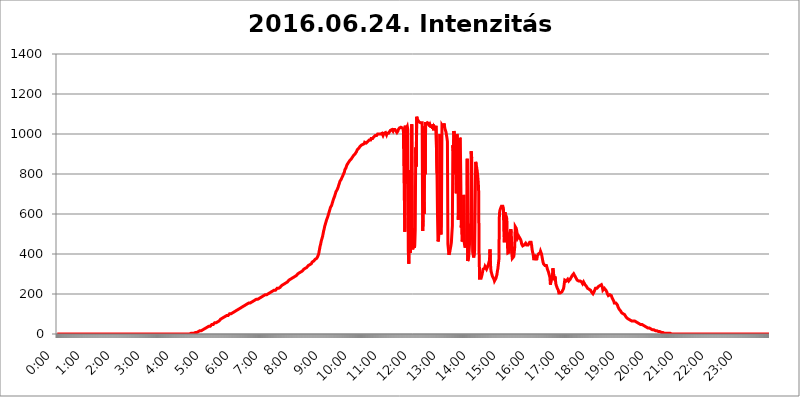
| Category | 2016.06.24. Intenzitás [W/m^2] |
|---|---|
| 0.0 | 0 |
| 0.0006944444444444445 | 0 |
| 0.001388888888888889 | 0 |
| 0.0020833333333333333 | 0 |
| 0.002777777777777778 | 0 |
| 0.003472222222222222 | 0 |
| 0.004166666666666667 | 0 |
| 0.004861111111111111 | 0 |
| 0.005555555555555556 | 0 |
| 0.0062499999999999995 | 0 |
| 0.006944444444444444 | 0 |
| 0.007638888888888889 | 0 |
| 0.008333333333333333 | 0 |
| 0.009027777777777779 | 0 |
| 0.009722222222222222 | 0 |
| 0.010416666666666666 | 0 |
| 0.011111111111111112 | 0 |
| 0.011805555555555555 | 0 |
| 0.012499999999999999 | 0 |
| 0.013194444444444444 | 0 |
| 0.013888888888888888 | 0 |
| 0.014583333333333332 | 0 |
| 0.015277777777777777 | 0 |
| 0.015972222222222224 | 0 |
| 0.016666666666666666 | 0 |
| 0.017361111111111112 | 0 |
| 0.018055555555555557 | 0 |
| 0.01875 | 0 |
| 0.019444444444444445 | 0 |
| 0.02013888888888889 | 0 |
| 0.020833333333333332 | 0 |
| 0.02152777777777778 | 0 |
| 0.022222222222222223 | 0 |
| 0.02291666666666667 | 0 |
| 0.02361111111111111 | 0 |
| 0.024305555555555556 | 0 |
| 0.024999999999999998 | 0 |
| 0.025694444444444447 | 0 |
| 0.02638888888888889 | 0 |
| 0.027083333333333334 | 0 |
| 0.027777777777777776 | 0 |
| 0.02847222222222222 | 0 |
| 0.029166666666666664 | 0 |
| 0.029861111111111113 | 0 |
| 0.030555555555555555 | 0 |
| 0.03125 | 0 |
| 0.03194444444444445 | 0 |
| 0.03263888888888889 | 0 |
| 0.03333333333333333 | 0 |
| 0.034027777777777775 | 0 |
| 0.034722222222222224 | 0 |
| 0.035416666666666666 | 0 |
| 0.036111111111111115 | 0 |
| 0.03680555555555556 | 0 |
| 0.0375 | 0 |
| 0.03819444444444444 | 0 |
| 0.03888888888888889 | 0 |
| 0.03958333333333333 | 0 |
| 0.04027777777777778 | 0 |
| 0.04097222222222222 | 0 |
| 0.041666666666666664 | 0 |
| 0.042361111111111106 | 0 |
| 0.04305555555555556 | 0 |
| 0.043750000000000004 | 0 |
| 0.044444444444444446 | 0 |
| 0.04513888888888889 | 0 |
| 0.04583333333333334 | 0 |
| 0.04652777777777778 | 0 |
| 0.04722222222222222 | 0 |
| 0.04791666666666666 | 0 |
| 0.04861111111111111 | 0 |
| 0.049305555555555554 | 0 |
| 0.049999999999999996 | 0 |
| 0.05069444444444445 | 0 |
| 0.051388888888888894 | 0 |
| 0.052083333333333336 | 0 |
| 0.05277777777777778 | 0 |
| 0.05347222222222222 | 0 |
| 0.05416666666666667 | 0 |
| 0.05486111111111111 | 0 |
| 0.05555555555555555 | 0 |
| 0.05625 | 0 |
| 0.05694444444444444 | 0 |
| 0.057638888888888885 | 0 |
| 0.05833333333333333 | 0 |
| 0.05902777777777778 | 0 |
| 0.059722222222222225 | 0 |
| 0.06041666666666667 | 0 |
| 0.061111111111111116 | 0 |
| 0.06180555555555556 | 0 |
| 0.0625 | 0 |
| 0.06319444444444444 | 0 |
| 0.06388888888888888 | 0 |
| 0.06458333333333334 | 0 |
| 0.06527777777777778 | 0 |
| 0.06597222222222222 | 0 |
| 0.06666666666666667 | 0 |
| 0.06736111111111111 | 0 |
| 0.06805555555555555 | 0 |
| 0.06874999999999999 | 0 |
| 0.06944444444444443 | 0 |
| 0.07013888888888889 | 0 |
| 0.07083333333333333 | 0 |
| 0.07152777777777779 | 0 |
| 0.07222222222222223 | 0 |
| 0.07291666666666667 | 0 |
| 0.07361111111111111 | 0 |
| 0.07430555555555556 | 0 |
| 0.075 | 0 |
| 0.07569444444444444 | 0 |
| 0.0763888888888889 | 0 |
| 0.07708333333333334 | 0 |
| 0.07777777777777778 | 0 |
| 0.07847222222222222 | 0 |
| 0.07916666666666666 | 0 |
| 0.0798611111111111 | 0 |
| 0.08055555555555556 | 0 |
| 0.08125 | 0 |
| 0.08194444444444444 | 0 |
| 0.08263888888888889 | 0 |
| 0.08333333333333333 | 0 |
| 0.08402777777777777 | 0 |
| 0.08472222222222221 | 0 |
| 0.08541666666666665 | 0 |
| 0.08611111111111112 | 0 |
| 0.08680555555555557 | 0 |
| 0.08750000000000001 | 0 |
| 0.08819444444444445 | 0 |
| 0.08888888888888889 | 0 |
| 0.08958333333333333 | 0 |
| 0.09027777777777778 | 0 |
| 0.09097222222222222 | 0 |
| 0.09166666666666667 | 0 |
| 0.09236111111111112 | 0 |
| 0.09305555555555556 | 0 |
| 0.09375 | 0 |
| 0.09444444444444444 | 0 |
| 0.09513888888888888 | 0 |
| 0.09583333333333333 | 0 |
| 0.09652777777777777 | 0 |
| 0.09722222222222222 | 0 |
| 0.09791666666666667 | 0 |
| 0.09861111111111111 | 0 |
| 0.09930555555555555 | 0 |
| 0.09999999999999999 | 0 |
| 0.10069444444444443 | 0 |
| 0.1013888888888889 | 0 |
| 0.10208333333333335 | 0 |
| 0.10277777777777779 | 0 |
| 0.10347222222222223 | 0 |
| 0.10416666666666667 | 0 |
| 0.10486111111111111 | 0 |
| 0.10555555555555556 | 0 |
| 0.10625 | 0 |
| 0.10694444444444444 | 0 |
| 0.1076388888888889 | 0 |
| 0.10833333333333334 | 0 |
| 0.10902777777777778 | 0 |
| 0.10972222222222222 | 0 |
| 0.1111111111111111 | 0 |
| 0.11180555555555556 | 0 |
| 0.11180555555555556 | 0 |
| 0.1125 | 0 |
| 0.11319444444444444 | 0 |
| 0.11388888888888889 | 0 |
| 0.11458333333333333 | 0 |
| 0.11527777777777777 | 0 |
| 0.11597222222222221 | 0 |
| 0.11666666666666665 | 0 |
| 0.1173611111111111 | 0 |
| 0.11805555555555557 | 0 |
| 0.11944444444444445 | 0 |
| 0.12013888888888889 | 0 |
| 0.12083333333333333 | 0 |
| 0.12152777777777778 | 0 |
| 0.12222222222222223 | 0 |
| 0.12291666666666667 | 0 |
| 0.12291666666666667 | 0 |
| 0.12361111111111112 | 0 |
| 0.12430555555555556 | 0 |
| 0.125 | 0 |
| 0.12569444444444444 | 0 |
| 0.12638888888888888 | 0 |
| 0.12708333333333333 | 0 |
| 0.16875 | 0 |
| 0.12847222222222224 | 0 |
| 0.12916666666666668 | 0 |
| 0.12986111111111112 | 0 |
| 0.13055555555555556 | 0 |
| 0.13125 | 0 |
| 0.13194444444444445 | 0 |
| 0.1326388888888889 | 0 |
| 0.13333333333333333 | 0 |
| 0.13402777777777777 | 0 |
| 0.13402777777777777 | 0 |
| 0.13472222222222222 | 0 |
| 0.13541666666666666 | 0 |
| 0.1361111111111111 | 0 |
| 0.13749999999999998 | 0 |
| 0.13819444444444443 | 0 |
| 0.1388888888888889 | 0 |
| 0.13958333333333334 | 0 |
| 0.14027777777777778 | 0 |
| 0.14097222222222222 | 0 |
| 0.14166666666666666 | 0 |
| 0.1423611111111111 | 0 |
| 0.14305555555555557 | 0 |
| 0.14375000000000002 | 0 |
| 0.14444444444444446 | 0 |
| 0.1451388888888889 | 0 |
| 0.1451388888888889 | 0 |
| 0.14652777777777778 | 0 |
| 0.14722222222222223 | 0 |
| 0.14791666666666667 | 0 |
| 0.1486111111111111 | 0 |
| 0.14930555555555555 | 0 |
| 0.15 | 0 |
| 0.15069444444444444 | 0 |
| 0.15138888888888888 | 0 |
| 0.15208333333333332 | 0 |
| 0.15277777777777776 | 0 |
| 0.15347222222222223 | 0 |
| 0.15416666666666667 | 0 |
| 0.15486111111111112 | 0 |
| 0.15555555555555556 | 0 |
| 0.15625 | 0 |
| 0.15694444444444444 | 0 |
| 0.15763888888888888 | 0 |
| 0.15833333333333333 | 0 |
| 0.15902777777777777 | 0 |
| 0.15972222222222224 | 0 |
| 0.16041666666666668 | 0 |
| 0.16111111111111112 | 0 |
| 0.16180555555555556 | 0 |
| 0.1625 | 0 |
| 0.16319444444444445 | 0 |
| 0.1638888888888889 | 0 |
| 0.16458333333333333 | 0 |
| 0.16527777777777777 | 0 |
| 0.16597222222222222 | 0 |
| 0.16666666666666666 | 0 |
| 0.1673611111111111 | 0 |
| 0.16805555555555554 | 0 |
| 0.16874999999999998 | 0 |
| 0.16944444444444443 | 0 |
| 0.17013888888888887 | 0 |
| 0.1708333333333333 | 0 |
| 0.17152777777777775 | 0 |
| 0.17222222222222225 | 0 |
| 0.1729166666666667 | 0 |
| 0.17361111111111113 | 0 |
| 0.17430555555555557 | 0 |
| 0.17500000000000002 | 0 |
| 0.17569444444444446 | 0 |
| 0.1763888888888889 | 0 |
| 0.17708333333333334 | 0 |
| 0.17777777777777778 | 0 |
| 0.17847222222222223 | 0 |
| 0.17916666666666667 | 0 |
| 0.1798611111111111 | 0 |
| 0.18055555555555555 | 0 |
| 0.18125 | 0 |
| 0.18194444444444444 | 0 |
| 0.1826388888888889 | 0 |
| 0.18333333333333335 | 0 |
| 0.1840277777777778 | 0 |
| 0.18472222222222223 | 0 |
| 0.18541666666666667 | 0 |
| 0.18611111111111112 | 0 |
| 0.18680555555555556 | 0 |
| 0.1875 | 3.525 |
| 0.18819444444444444 | 3.525 |
| 0.18888888888888888 | 3.525 |
| 0.18958333333333333 | 3.525 |
| 0.19027777777777777 | 3.525 |
| 0.1909722222222222 | 3.525 |
| 0.19166666666666665 | 3.525 |
| 0.19236111111111112 | 3.525 |
| 0.19305555555555554 | 7.887 |
| 0.19375 | 7.887 |
| 0.19444444444444445 | 7.887 |
| 0.1951388888888889 | 7.887 |
| 0.19583333333333333 | 7.887 |
| 0.19652777777777777 | 12.257 |
| 0.19722222222222222 | 12.257 |
| 0.19791666666666666 | 12.257 |
| 0.1986111111111111 | 12.257 |
| 0.19930555555555554 | 12.257 |
| 0.19999999999999998 | 16.636 |
| 0.20069444444444443 | 16.636 |
| 0.20138888888888887 | 16.636 |
| 0.2020833333333333 | 16.636 |
| 0.2027777777777778 | 21.024 |
| 0.2034722222222222 | 21.024 |
| 0.2041666666666667 | 21.024 |
| 0.20486111111111113 | 21.024 |
| 0.20555555555555557 | 25.419 |
| 0.20625000000000002 | 25.419 |
| 0.20694444444444446 | 25.419 |
| 0.2076388888888889 | 29.823 |
| 0.20833333333333334 | 29.823 |
| 0.20902777777777778 | 29.823 |
| 0.20972222222222223 | 29.823 |
| 0.21041666666666667 | 34.234 |
| 0.2111111111111111 | 34.234 |
| 0.21180555555555555 | 34.234 |
| 0.2125 | 38.653 |
| 0.21319444444444444 | 38.653 |
| 0.2138888888888889 | 38.653 |
| 0.21458333333333335 | 38.653 |
| 0.2152777777777778 | 43.079 |
| 0.21597222222222223 | 43.079 |
| 0.21666666666666667 | 47.511 |
| 0.21736111111111112 | 47.511 |
| 0.21805555555555556 | 47.511 |
| 0.21875 | 47.511 |
| 0.21944444444444444 | 51.951 |
| 0.22013888888888888 | 51.951 |
| 0.22083333333333333 | 56.398 |
| 0.22152777777777777 | 56.398 |
| 0.2222222222222222 | 56.398 |
| 0.22291666666666665 | 56.398 |
| 0.2236111111111111 | 60.85 |
| 0.22430555555555556 | 60.85 |
| 0.225 | 60.85 |
| 0.22569444444444445 | 65.31 |
| 0.2263888888888889 | 65.31 |
| 0.22708333333333333 | 65.31 |
| 0.22777777777777777 | 69.775 |
| 0.22847222222222222 | 69.775 |
| 0.22916666666666666 | 74.246 |
| 0.2298611111111111 | 74.246 |
| 0.23055555555555554 | 74.246 |
| 0.23124999999999998 | 78.722 |
| 0.23194444444444443 | 78.722 |
| 0.23263888888888887 | 78.722 |
| 0.2333333333333333 | 83.205 |
| 0.2340277777777778 | 83.205 |
| 0.2347222222222222 | 83.205 |
| 0.2354166666666667 | 87.692 |
| 0.23611111111111113 | 87.692 |
| 0.23680555555555557 | 87.692 |
| 0.23750000000000002 | 92.184 |
| 0.23819444444444446 | 92.184 |
| 0.2388888888888889 | 92.184 |
| 0.23958333333333334 | 92.184 |
| 0.24027777777777778 | 96.682 |
| 0.24097222222222223 | 96.682 |
| 0.24166666666666667 | 101.184 |
| 0.2423611111111111 | 101.184 |
| 0.24305555555555555 | 101.184 |
| 0.24375 | 101.184 |
| 0.24444444444444446 | 105.69 |
| 0.24513888888888888 | 105.69 |
| 0.24583333333333335 | 105.69 |
| 0.2465277777777778 | 110.201 |
| 0.24722222222222223 | 110.201 |
| 0.24791666666666667 | 110.201 |
| 0.24861111111111112 | 114.716 |
| 0.24930555555555556 | 114.716 |
| 0.25 | 114.716 |
| 0.25069444444444444 | 119.235 |
| 0.2513888888888889 | 119.235 |
| 0.2520833333333333 | 119.235 |
| 0.25277777777777777 | 123.758 |
| 0.2534722222222222 | 123.758 |
| 0.25416666666666665 | 123.758 |
| 0.2548611111111111 | 128.284 |
| 0.2555555555555556 | 128.284 |
| 0.25625000000000003 | 128.284 |
| 0.2569444444444445 | 128.284 |
| 0.2576388888888889 | 132.814 |
| 0.25833333333333336 | 132.814 |
| 0.2590277777777778 | 137.347 |
| 0.25972222222222224 | 137.347 |
| 0.2604166666666667 | 137.347 |
| 0.2611111111111111 | 137.347 |
| 0.26180555555555557 | 137.347 |
| 0.2625 | 141.884 |
| 0.26319444444444445 | 141.884 |
| 0.2638888888888889 | 146.423 |
| 0.26458333333333334 | 146.423 |
| 0.2652777777777778 | 146.423 |
| 0.2659722222222222 | 146.423 |
| 0.26666666666666666 | 150.964 |
| 0.2673611111111111 | 150.964 |
| 0.26805555555555555 | 150.964 |
| 0.26875 | 155.509 |
| 0.26944444444444443 | 155.509 |
| 0.2701388888888889 | 155.509 |
| 0.2708333333333333 | 155.509 |
| 0.27152777777777776 | 160.056 |
| 0.2722222222222222 | 160.056 |
| 0.27291666666666664 | 160.056 |
| 0.2736111111111111 | 164.605 |
| 0.2743055555555555 | 164.605 |
| 0.27499999999999997 | 164.605 |
| 0.27569444444444446 | 164.605 |
| 0.27638888888888885 | 169.156 |
| 0.27708333333333335 | 169.156 |
| 0.2777777777777778 | 169.156 |
| 0.27847222222222223 | 169.156 |
| 0.2791666666666667 | 173.709 |
| 0.2798611111111111 | 173.709 |
| 0.28055555555555556 | 173.709 |
| 0.28125 | 173.709 |
| 0.28194444444444444 | 178.264 |
| 0.2826388888888889 | 178.264 |
| 0.2833333333333333 | 178.264 |
| 0.28402777777777777 | 182.82 |
| 0.2847222222222222 | 182.82 |
| 0.28541666666666665 | 182.82 |
| 0.28611111111111115 | 182.82 |
| 0.28680555555555554 | 187.378 |
| 0.28750000000000003 | 187.378 |
| 0.2881944444444445 | 187.378 |
| 0.2888888888888889 | 187.378 |
| 0.28958333333333336 | 191.937 |
| 0.2902777777777778 | 191.937 |
| 0.29097222222222224 | 191.937 |
| 0.2916666666666667 | 196.497 |
| 0.2923611111111111 | 196.497 |
| 0.29305555555555557 | 196.497 |
| 0.29375 | 196.497 |
| 0.29444444444444445 | 201.058 |
| 0.2951388888888889 | 201.058 |
| 0.29583333333333334 | 201.058 |
| 0.2965277777777778 | 201.058 |
| 0.2972222222222222 | 205.62 |
| 0.29791666666666666 | 205.62 |
| 0.2986111111111111 | 205.62 |
| 0.29930555555555555 | 210.182 |
| 0.3 | 210.182 |
| 0.30069444444444443 | 210.182 |
| 0.3013888888888889 | 210.182 |
| 0.3020833333333333 | 214.746 |
| 0.30277777777777776 | 214.746 |
| 0.3034722222222222 | 214.746 |
| 0.30416666666666664 | 219.309 |
| 0.3048611111111111 | 219.309 |
| 0.3055555555555555 | 219.309 |
| 0.30624999999999997 | 219.309 |
| 0.3069444444444444 | 223.873 |
| 0.3076388888888889 | 223.873 |
| 0.30833333333333335 | 228.436 |
| 0.3090277777777778 | 228.436 |
| 0.30972222222222223 | 228.436 |
| 0.3104166666666667 | 228.436 |
| 0.3111111111111111 | 233 |
| 0.31180555555555556 | 233 |
| 0.3125 | 233 |
| 0.31319444444444444 | 237.564 |
| 0.3138888888888889 | 237.564 |
| 0.3145833333333333 | 242.127 |
| 0.31527777777777777 | 242.127 |
| 0.3159722222222222 | 242.127 |
| 0.31666666666666665 | 246.689 |
| 0.31736111111111115 | 246.689 |
| 0.31805555555555554 | 246.689 |
| 0.31875000000000003 | 251.251 |
| 0.3194444444444445 | 251.251 |
| 0.3201388888888889 | 255.813 |
| 0.32083333333333336 | 255.813 |
| 0.3215277777777778 | 260.373 |
| 0.32222222222222224 | 260.373 |
| 0.3229166666666667 | 260.373 |
| 0.3236111111111111 | 264.932 |
| 0.32430555555555557 | 264.932 |
| 0.325 | 269.49 |
| 0.32569444444444445 | 269.49 |
| 0.3263888888888889 | 269.49 |
| 0.32708333333333334 | 274.047 |
| 0.3277777777777778 | 274.047 |
| 0.3284722222222222 | 274.047 |
| 0.32916666666666666 | 278.603 |
| 0.3298611111111111 | 278.603 |
| 0.33055555555555555 | 278.603 |
| 0.33125 | 283.156 |
| 0.33194444444444443 | 283.156 |
| 0.3326388888888889 | 287.709 |
| 0.3333333333333333 | 287.709 |
| 0.3340277777777778 | 287.709 |
| 0.3347222222222222 | 292.259 |
| 0.3354166666666667 | 292.259 |
| 0.3361111111111111 | 296.808 |
| 0.3368055555555556 | 296.808 |
| 0.33749999999999997 | 301.354 |
| 0.33819444444444446 | 301.354 |
| 0.33888888888888885 | 305.898 |
| 0.33958333333333335 | 305.898 |
| 0.34027777777777773 | 305.898 |
| 0.34097222222222223 | 305.898 |
| 0.3416666666666666 | 310.44 |
| 0.3423611111111111 | 314.98 |
| 0.3430555555555555 | 314.98 |
| 0.34375 | 314.98 |
| 0.3444444444444445 | 319.517 |
| 0.3451388888888889 | 319.517 |
| 0.3458333333333334 | 324.052 |
| 0.34652777777777777 | 324.052 |
| 0.34722222222222227 | 328.584 |
| 0.34791666666666665 | 328.584 |
| 0.34861111111111115 | 333.113 |
| 0.34930555555555554 | 333.113 |
| 0.35000000000000003 | 333.113 |
| 0.3506944444444444 | 337.639 |
| 0.3513888888888889 | 337.639 |
| 0.3520833333333333 | 342.162 |
| 0.3527777777777778 | 342.162 |
| 0.3534722222222222 | 346.682 |
| 0.3541666666666667 | 346.682 |
| 0.3548611111111111 | 351.198 |
| 0.35555555555555557 | 351.198 |
| 0.35625 | 351.198 |
| 0.35694444444444445 | 355.712 |
| 0.3576388888888889 | 360.221 |
| 0.35833333333333334 | 360.221 |
| 0.3590277777777778 | 364.728 |
| 0.3597222222222222 | 364.728 |
| 0.36041666666666666 | 369.23 |
| 0.3611111111111111 | 369.23 |
| 0.36180555555555555 | 373.729 |
| 0.3625 | 373.729 |
| 0.36319444444444443 | 373.729 |
| 0.3638888888888889 | 378.224 |
| 0.3645833333333333 | 382.715 |
| 0.3652777777777778 | 387.202 |
| 0.3659722222222222 | 391.685 |
| 0.3666666666666667 | 400.638 |
| 0.3673611111111111 | 414.035 |
| 0.3680555555555556 | 427.39 |
| 0.36874999999999997 | 440.702 |
| 0.36944444444444446 | 449.551 |
| 0.37013888888888885 | 462.786 |
| 0.37083333333333335 | 471.582 |
| 0.37152777777777773 | 480.356 |
| 0.37222222222222223 | 489.108 |
| 0.3729166666666666 | 502.192 |
| 0.3736111111111111 | 515.223 |
| 0.3743055555555555 | 523.88 |
| 0.375 | 536.82 |
| 0.3756944444444445 | 545.416 |
| 0.3763888888888889 | 553.986 |
| 0.3770833333333334 | 562.53 |
| 0.37777777777777777 | 571.049 |
| 0.37847222222222227 | 575.299 |
| 0.37916666666666665 | 583.779 |
| 0.37986111111111115 | 592.233 |
| 0.38055555555555554 | 600.661 |
| 0.38125000000000003 | 609.062 |
| 0.3819444444444444 | 617.436 |
| 0.3826388888888889 | 625.784 |
| 0.3833333333333333 | 634.105 |
| 0.3840277777777778 | 638.256 |
| 0.3847222222222222 | 642.4 |
| 0.3854166666666667 | 650.667 |
| 0.3861111111111111 | 658.909 |
| 0.38680555555555557 | 667.123 |
| 0.3875 | 675.311 |
| 0.38819444444444445 | 679.395 |
| 0.3888888888888889 | 687.544 |
| 0.38958333333333334 | 691.608 |
| 0.3902777777777778 | 703.762 |
| 0.3909722222222222 | 711.832 |
| 0.39166666666666666 | 715.858 |
| 0.3923611111111111 | 719.877 |
| 0.39305555555555555 | 719.877 |
| 0.39375 | 731.896 |
| 0.39444444444444443 | 735.89 |
| 0.3951388888888889 | 747.834 |
| 0.3958333333333333 | 751.803 |
| 0.3965277777777778 | 763.674 |
| 0.3972222222222222 | 763.674 |
| 0.3979166666666667 | 771.559 |
| 0.3986111111111111 | 775.492 |
| 0.3993055555555556 | 771.559 |
| 0.39999999999999997 | 787.258 |
| 0.40069444444444446 | 791.169 |
| 0.40138888888888885 | 798.974 |
| 0.40208333333333335 | 802.868 |
| 0.40277777777777773 | 810.641 |
| 0.40347222222222223 | 822.26 |
| 0.4041666666666666 | 826.123 |
| 0.4048611111111111 | 829.981 |
| 0.4055555555555555 | 837.682 |
| 0.40625 | 845.365 |
| 0.4069444444444445 | 849.199 |
| 0.4076388888888889 | 853.029 |
| 0.4083333333333334 | 856.855 |
| 0.40902777777777777 | 860.676 |
| 0.40972222222222227 | 860.676 |
| 0.41041666666666665 | 868.305 |
| 0.41111111111111115 | 868.305 |
| 0.41180555555555554 | 872.114 |
| 0.41250000000000003 | 875.918 |
| 0.4131944444444444 | 875.918 |
| 0.4138888888888889 | 883.516 |
| 0.4145833333333333 | 883.516 |
| 0.4152777777777778 | 891.099 |
| 0.4159722222222222 | 891.099 |
| 0.4166666666666667 | 894.885 |
| 0.4173611111111111 | 898.668 |
| 0.41805555555555557 | 898.668 |
| 0.41875 | 902.447 |
| 0.41944444444444445 | 909.996 |
| 0.4201388888888889 | 909.996 |
| 0.42083333333333334 | 921.298 |
| 0.4215277777777778 | 925.06 |
| 0.4222222222222222 | 925.06 |
| 0.42291666666666666 | 928.819 |
| 0.4236111111111111 | 932.576 |
| 0.42430555555555555 | 936.33 |
| 0.425 | 932.576 |
| 0.42569444444444443 | 936.33 |
| 0.4263888888888889 | 943.832 |
| 0.4270833333333333 | 947.58 |
| 0.4277777777777778 | 947.58 |
| 0.4284722222222222 | 947.58 |
| 0.4291666666666667 | 947.58 |
| 0.4298611111111111 | 951.327 |
| 0.4305555555555556 | 951.327 |
| 0.43124999999999997 | 958.814 |
| 0.43194444444444446 | 958.814 |
| 0.43263888888888885 | 955.071 |
| 0.43333333333333335 | 955.071 |
| 0.43402777777777773 | 955.071 |
| 0.43472222222222223 | 958.814 |
| 0.4354166666666666 | 962.555 |
| 0.4361111111111111 | 966.295 |
| 0.4368055555555555 | 966.295 |
| 0.4375 | 970.034 |
| 0.4381944444444445 | 970.034 |
| 0.4388888888888889 | 970.034 |
| 0.4395833333333334 | 970.034 |
| 0.44027777777777777 | 977.508 |
| 0.44097222222222227 | 977.508 |
| 0.44166666666666665 | 977.508 |
| 0.44236111111111115 | 977.508 |
| 0.44305555555555554 | 981.244 |
| 0.44375000000000003 | 984.98 |
| 0.4444444444444444 | 988.714 |
| 0.4451388888888889 | 988.714 |
| 0.4458333333333333 | 992.448 |
| 0.4465277777777778 | 992.448 |
| 0.4472222222222222 | 996.182 |
| 0.4479166666666667 | 992.448 |
| 0.4486111111111111 | 996.182 |
| 0.44930555555555557 | 999.916 |
| 0.45 | 999.916 |
| 0.45069444444444445 | 1003.65 |
| 0.4513888888888889 | 999.916 |
| 0.45208333333333334 | 996.182 |
| 0.4527777777777778 | 996.182 |
| 0.4534722222222222 | 999.916 |
| 0.45416666666666666 | 999.916 |
| 0.4548611111111111 | 1003.65 |
| 0.45555555555555555 | 1003.65 |
| 0.45625 | 999.916 |
| 0.45694444444444443 | 992.448 |
| 0.4576388888888889 | 988.714 |
| 0.4583333333333333 | 1003.65 |
| 0.4590277777777778 | 1007.383 |
| 0.4597222222222222 | 1007.383 |
| 0.4604166666666667 | 1007.383 |
| 0.4611111111111111 | 1007.383 |
| 0.4618055555555556 | 996.182 |
| 0.46249999999999997 | 1003.65 |
| 0.46319444444444446 | 999.916 |
| 0.46388888888888885 | 1003.65 |
| 0.46458333333333335 | 1003.65 |
| 0.46527777777777773 | 1007.383 |
| 0.46597222222222223 | 1011.118 |
| 0.4666666666666666 | 1014.852 |
| 0.4673611111111111 | 1018.587 |
| 0.4680555555555555 | 1022.323 |
| 0.46875 | 1018.587 |
| 0.4694444444444445 | 1022.323 |
| 0.4701388888888889 | 1022.323 |
| 0.4708333333333334 | 1014.852 |
| 0.47152777777777777 | 1022.323 |
| 0.47222222222222227 | 1022.323 |
| 0.47291666666666665 | 1022.323 |
| 0.47361111111111115 | 1022.323 |
| 0.47430555555555554 | 1022.323 |
| 0.47500000000000003 | 1014.852 |
| 0.4756944444444444 | 1014.852 |
| 0.4763888888888889 | 1007.383 |
| 0.4770833333333333 | 1011.118 |
| 0.4777777777777778 | 1014.852 |
| 0.4784722222222222 | 1022.323 |
| 0.4791666666666667 | 1022.323 |
| 0.4798611111111111 | 1029.798 |
| 0.48055555555555557 | 1029.798 |
| 0.48125 | 1033.537 |
| 0.48194444444444445 | 1033.537 |
| 0.4826388888888889 | 1029.798 |
| 0.48333333333333334 | 1033.537 |
| 0.4840277777777778 | 1029.798 |
| 0.4847222222222222 | 1033.537 |
| 0.48541666666666666 | 1022.323 |
| 0.4861111111111111 | 1018.587 |
| 0.48680555555555555 | 1022.323 |
| 0.4875 | 510.885 |
| 0.48819444444444443 | 1041.019 |
| 0.4888888888888889 | 751.803 |
| 0.4895833333333333 | 1026.06 |
| 0.4902777777777778 | 1022.323 |
| 0.4909722222222222 | 1037.277 |
| 0.4916666666666667 | 1022.323 |
| 0.4923611111111111 | 414.035 |
| 0.4930555555555556 | 351.198 |
| 0.49374999999999997 | 355.712 |
| 0.49444444444444446 | 818.392 |
| 0.49513888888888885 | 405.108 |
| 0.49583333333333335 | 431.833 |
| 0.49652777777777773 | 667.123 |
| 0.49722222222222223 | 1048.508 |
| 0.4979166666666666 | 489.108 |
| 0.4986111111111111 | 422.943 |
| 0.4993055555555555 | 445.129 |
| 0.5 | 528.2 |
| 0.5006944444444444 | 431.833 |
| 0.5013888888888889 | 440.702 |
| 0.5020833333333333 | 519.555 |
| 0.5027777777777778 | 932.576 |
| 0.5034722222222222 | 837.682 |
| 0.5041666666666667 | 1086.097 |
| 0.5048611111111111 | 1074.789 |
| 0.5055555555555555 | 1071.027 |
| 0.50625 | 1067.267 |
| 0.5069444444444444 | 1063.51 |
| 0.5076388888888889 | 1059.756 |
| 0.5083333333333333 | 1059.756 |
| 0.5090277777777777 | 1059.756 |
| 0.5097222222222222 | 1056.004 |
| 0.5104166666666666 | 1056.004 |
| 0.5111111111111112 | 1056.004 |
| 0.5118055555555555 | 1056.004 |
| 0.5125000000000001 | 515.223 |
| 0.5131944444444444 | 566.793 |
| 0.513888888888889 | 658.909 |
| 0.5145833333333333 | 600.661 |
| 0.5152777777777778 | 1037.277 |
| 0.5159722222222222 | 798.974 |
| 0.5166666666666667 | 1059.756 |
| 0.517361111111111 | 1059.756 |
| 0.5180555555555556 | 1048.508 |
| 0.5187499999999999 | 1052.255 |
| 0.5194444444444445 | 1056.004 |
| 0.5201388888888888 | 1052.255 |
| 0.5208333333333334 | 1052.255 |
| 0.5215277777777778 | 1052.255 |
| 0.5222222222222223 | 1037.277 |
| 0.5229166666666667 | 1044.762 |
| 0.5236111111111111 | 1037.277 |
| 0.5243055555555556 | 1033.537 |
| 0.525 | 1041.019 |
| 0.5256944444444445 | 1037.277 |
| 0.5263888888888889 | 1026.06 |
| 0.5270833333333333 | 1048.508 |
| 0.5277777777777778 | 1018.587 |
| 0.5284722222222222 | 1037.277 |
| 0.5291666666666667 | 1033.537 |
| 0.5298611111111111 | 1029.798 |
| 0.5305555555555556 | 1026.06 |
| 0.53125 | 1041.019 |
| 0.5319444444444444 | 1044.762 |
| 0.5326388888888889 | 802.868 |
| 0.5333333333333333 | 592.233 |
| 0.5340277777777778 | 462.786 |
| 0.5347222222222222 | 471.582 |
| 0.5354166666666667 | 515.223 |
| 0.5361111111111111 | 523.88 |
| 0.5368055555555555 | 999.916 |
| 0.5375 | 541.121 |
| 0.5381944444444444 | 497.836 |
| 0.5388888888888889 | 613.252 |
| 0.5395833333333333 | 1044.762 |
| 0.5402777777777777 | 1041.019 |
| 0.5409722222222222 | 1037.277 |
| 0.5416666666666666 | 1029.798 |
| 0.5423611111111112 | 1052.255 |
| 0.5430555555555555 | 1041.019 |
| 0.5437500000000001 | 1026.06 |
| 0.5444444444444444 | 1022.323 |
| 0.545138888888889 | 1011.118 |
| 0.5458333333333333 | 996.182 |
| 0.5465277777777778 | 981.244 |
| 0.5472222222222222 | 962.555 |
| 0.5479166666666667 | 449.551 |
| 0.548611111111111 | 422.943 |
| 0.5493055555555556 | 396.164 |
| 0.5499999999999999 | 400.638 |
| 0.5506944444444445 | 414.035 |
| 0.5513888888888888 | 427.39 |
| 0.5520833333333334 | 440.702 |
| 0.5527777777777778 | 458.38 |
| 0.5534722222222223 | 502.192 |
| 0.5541666666666667 | 541.121 |
| 0.5548611111111111 | 943.832 |
| 0.5555555555555556 | 917.534 |
| 0.55625 | 1014.852 |
| 0.5569444444444445 | 999.916 |
| 0.5576388888888889 | 992.448 |
| 0.5583333333333333 | 798.974 |
| 0.5590277777777778 | 913.766 |
| 0.5597222222222222 | 703.762 |
| 0.5604166666666667 | 999.916 |
| 0.5611111111111111 | 984.98 |
| 0.5618055555555556 | 955.071 |
| 0.5625 | 571.049 |
| 0.5631944444444444 | 695.666 |
| 0.5638888888888889 | 751.803 |
| 0.5645833333333333 | 981.244 |
| 0.5652777777777778 | 973.772 |
| 0.5659722222222222 | 779.42 |
| 0.5666666666666667 | 532.513 |
| 0.5673611111111111 | 583.779 |
| 0.5680555555555555 | 462.786 |
| 0.56875 | 462.786 |
| 0.5694444444444444 | 506.542 |
| 0.5701388888888889 | 695.666 |
| 0.5708333333333333 | 458.38 |
| 0.5715277777777777 | 440.702 |
| 0.5722222222222222 | 431.833 |
| 0.5729166666666666 | 445.129 |
| 0.5736111111111112 | 445.129 |
| 0.5743055555555555 | 458.38 |
| 0.5750000000000001 | 875.918 |
| 0.5756944444444444 | 364.728 |
| 0.576388888888889 | 369.23 |
| 0.5770833333333333 | 387.202 |
| 0.5777777777777778 | 422.943 |
| 0.5784722222222222 | 467.187 |
| 0.5791666666666667 | 528.2 |
| 0.579861111111111 | 558.261 |
| 0.5805555555555556 | 913.766 |
| 0.5812499999999999 | 879.719 |
| 0.5819444444444445 | 617.436 |
| 0.5826388888888888 | 409.574 |
| 0.5833333333333334 | 396.164 |
| 0.5840277777777778 | 382.715 |
| 0.5847222222222223 | 387.202 |
| 0.5854166666666667 | 418.492 |
| 0.5861111111111111 | 625.784 |
| 0.5868055555555556 | 860.676 |
| 0.5875 | 849.199 |
| 0.5881944444444445 | 833.834 |
| 0.5888888888888889 | 818.392 |
| 0.5895833333333333 | 795.074 |
| 0.5902777777777778 | 767.62 |
| 0.5909722222222222 | 727.896 |
| 0.5916666666666667 | 405.108 |
| 0.5923611111111111 | 278.603 |
| 0.5930555555555556 | 278.603 |
| 0.59375 | 278.603 |
| 0.5944444444444444 | 278.603 |
| 0.5951388888888889 | 283.156 |
| 0.5958333333333333 | 296.808 |
| 0.5965277777777778 | 310.44 |
| 0.5972222222222222 | 324.052 |
| 0.5979166666666667 | 328.584 |
| 0.5986111111111111 | 328.584 |
| 0.5993055555555555 | 328.584 |
| 0.6 | 337.639 |
| 0.6006944444444444 | 342.162 |
| 0.6013888888888889 | 337.639 |
| 0.6020833333333333 | 324.052 |
| 0.6027777777777777 | 324.052 |
| 0.6034722222222222 | 328.584 |
| 0.6041666666666666 | 342.162 |
| 0.6048611111111112 | 346.682 |
| 0.6055555555555555 | 346.682 |
| 0.6062500000000001 | 369.23 |
| 0.6069444444444444 | 422.943 |
| 0.607638888888889 | 346.682 |
| 0.6083333333333333 | 314.98 |
| 0.6090277777777778 | 305.898 |
| 0.6097222222222222 | 301.354 |
| 0.6104166666666667 | 287.709 |
| 0.611111111111111 | 283.156 |
| 0.6118055555555556 | 283.156 |
| 0.6124999999999999 | 274.047 |
| 0.6131944444444445 | 264.932 |
| 0.6138888888888888 | 264.932 |
| 0.6145833333333334 | 269.49 |
| 0.6152777777777778 | 278.603 |
| 0.6159722222222223 | 283.156 |
| 0.6166666666666667 | 296.808 |
| 0.6173611111111111 | 314.98 |
| 0.6180555555555556 | 328.584 |
| 0.61875 | 351.198 |
| 0.6194444444444445 | 373.729 |
| 0.6201388888888889 | 600.661 |
| 0.6208333333333333 | 617.436 |
| 0.6215277777777778 | 625.784 |
| 0.6222222222222222 | 629.948 |
| 0.6229166666666667 | 638.256 |
| 0.6236111111111111 | 642.4 |
| 0.6243055555555556 | 642.4 |
| 0.625 | 638.256 |
| 0.6256944444444444 | 629.948 |
| 0.6263888888888889 | 515.223 |
| 0.6270833333333333 | 458.38 |
| 0.6277777777777778 | 609.062 |
| 0.6284722222222222 | 596.45 |
| 0.6291666666666667 | 600.661 |
| 0.6298611111111111 | 588.009 |
| 0.6305555555555555 | 575.299 |
| 0.63125 | 462.786 |
| 0.6319444444444444 | 405.108 |
| 0.6326388888888889 | 409.574 |
| 0.6333333333333333 | 409.574 |
| 0.6340277777777777 | 409.574 |
| 0.6347222222222222 | 409.574 |
| 0.6354166666666666 | 515.223 |
| 0.6361111111111112 | 523.88 |
| 0.6368055555555555 | 506.542 |
| 0.6375000000000001 | 405.108 |
| 0.6381944444444444 | 378.224 |
| 0.638888888888889 | 378.224 |
| 0.6395833333333333 | 382.715 |
| 0.6402777777777778 | 387.202 |
| 0.6409722222222222 | 409.574 |
| 0.6416666666666667 | 436.27 |
| 0.642361111111111 | 536.82 |
| 0.6430555555555556 | 541.121 |
| 0.6437499999999999 | 528.2 |
| 0.6444444444444445 | 515.223 |
| 0.6451388888888888 | 497.836 |
| 0.6458333333333334 | 480.356 |
| 0.6465277777777778 | 484.735 |
| 0.6472222222222223 | 489.108 |
| 0.6479166666666667 | 484.735 |
| 0.6486111111111111 | 480.356 |
| 0.6493055555555556 | 480.356 |
| 0.65 | 471.582 |
| 0.6506944444444445 | 462.786 |
| 0.6513888888888889 | 449.551 |
| 0.6520833333333333 | 445.129 |
| 0.6527777777777778 | 440.702 |
| 0.6534722222222222 | 440.702 |
| 0.6541666666666667 | 440.702 |
| 0.6548611111111111 | 445.129 |
| 0.6555555555555556 | 449.551 |
| 0.65625 | 449.551 |
| 0.6569444444444444 | 453.968 |
| 0.6576388888888889 | 449.551 |
| 0.6583333333333333 | 445.129 |
| 0.6590277777777778 | 440.702 |
| 0.6597222222222222 | 440.702 |
| 0.6604166666666667 | 445.129 |
| 0.6611111111111111 | 445.129 |
| 0.6618055555555555 | 449.551 |
| 0.6625 | 458.38 |
| 0.6631944444444444 | 462.786 |
| 0.6638888888888889 | 462.786 |
| 0.6645833333333333 | 458.38 |
| 0.6652777777777777 | 445.129 |
| 0.6659722222222222 | 422.943 |
| 0.6666666666666666 | 409.574 |
| 0.6673611111111111 | 400.638 |
| 0.6680555555555556 | 382.715 |
| 0.6687500000000001 | 369.23 |
| 0.6694444444444444 | 396.164 |
| 0.6701388888888888 | 396.164 |
| 0.6708333333333334 | 373.729 |
| 0.6715277777777778 | 387.202 |
| 0.6722222222222222 | 369.23 |
| 0.6729166666666666 | 387.202 |
| 0.6736111111111112 | 391.685 |
| 0.6743055555555556 | 391.685 |
| 0.6749999999999999 | 400.638 |
| 0.6756944444444444 | 405.108 |
| 0.6763888888888889 | 405.108 |
| 0.6770833333333334 | 405.108 |
| 0.6777777777777777 | 414.035 |
| 0.6784722222222223 | 409.574 |
| 0.6791666666666667 | 400.638 |
| 0.6798611111111111 | 387.202 |
| 0.6805555555555555 | 373.729 |
| 0.68125 | 360.221 |
| 0.6819444444444445 | 351.198 |
| 0.6826388888888889 | 346.682 |
| 0.6833333333333332 | 346.682 |
| 0.6840277777777778 | 342.162 |
| 0.6847222222222222 | 342.162 |
| 0.6854166666666667 | 337.639 |
| 0.686111111111111 | 342.162 |
| 0.6868055555555556 | 333.113 |
| 0.6875 | 324.052 |
| 0.6881944444444444 | 319.517 |
| 0.688888888888889 | 310.44 |
| 0.6895833333333333 | 301.354 |
| 0.6902777777777778 | 292.259 |
| 0.6909722222222222 | 283.156 |
| 0.6916666666666668 | 246.689 |
| 0.6923611111111111 | 242.127 |
| 0.6930555555555555 | 278.603 |
| 0.69375 | 269.49 |
| 0.6944444444444445 | 287.709 |
| 0.6951388888888889 | 328.584 |
| 0.6958333333333333 | 333.113 |
| 0.6965277777777777 | 324.052 |
| 0.6972222222222223 | 269.49 |
| 0.6979166666666666 | 287.709 |
| 0.6986111111111111 | 274.047 |
| 0.6993055555555556 | 251.251 |
| 0.7000000000000001 | 242.127 |
| 0.7006944444444444 | 237.564 |
| 0.7013888888888888 | 228.436 |
| 0.7020833333333334 | 223.873 |
| 0.7027777777777778 | 219.309 |
| 0.7034722222222222 | 205.62 |
| 0.7041666666666666 | 201.058 |
| 0.7048611111111112 | 201.058 |
| 0.7055555555555556 | 205.62 |
| 0.7062499999999999 | 205.62 |
| 0.7069444444444444 | 205.62 |
| 0.7076388888888889 | 210.182 |
| 0.7083333333333334 | 210.182 |
| 0.7090277777777777 | 214.746 |
| 0.7097222222222223 | 223.873 |
| 0.7104166666666667 | 233 |
| 0.7111111111111111 | 251.251 |
| 0.7118055555555555 | 269.49 |
| 0.7125 | 264.932 |
| 0.7131944444444445 | 264.932 |
| 0.7138888888888889 | 264.932 |
| 0.7145833333333332 | 269.49 |
| 0.7152777777777778 | 269.49 |
| 0.7159722222222222 | 274.047 |
| 0.7166666666666667 | 269.49 |
| 0.717361111111111 | 264.932 |
| 0.7180555555555556 | 269.49 |
| 0.71875 | 269.49 |
| 0.7194444444444444 | 274.047 |
| 0.720138888888889 | 278.603 |
| 0.7208333333333333 | 283.156 |
| 0.7215277777777778 | 287.709 |
| 0.7222222222222222 | 292.259 |
| 0.7229166666666668 | 296.808 |
| 0.7236111111111111 | 296.808 |
| 0.7243055555555555 | 301.354 |
| 0.725 | 296.808 |
| 0.7256944444444445 | 292.259 |
| 0.7263888888888889 | 287.709 |
| 0.7270833333333333 | 287.709 |
| 0.7277777777777777 | 278.603 |
| 0.7284722222222223 | 274.047 |
| 0.7291666666666666 | 269.49 |
| 0.7298611111111111 | 264.932 |
| 0.7305555555555556 | 264.932 |
| 0.7312500000000001 | 264.932 |
| 0.7319444444444444 | 269.49 |
| 0.7326388888888888 | 269.49 |
| 0.7333333333333334 | 264.932 |
| 0.7340277777777778 | 260.373 |
| 0.7347222222222222 | 260.373 |
| 0.7354166666666666 | 260.373 |
| 0.7361111111111112 | 255.813 |
| 0.7368055555555556 | 251.251 |
| 0.7374999999999999 | 255.813 |
| 0.7381944444444444 | 260.373 |
| 0.7388888888888889 | 260.373 |
| 0.7395833333333334 | 255.813 |
| 0.7402777777777777 | 246.689 |
| 0.7409722222222223 | 242.127 |
| 0.7416666666666667 | 242.127 |
| 0.7423611111111111 | 237.564 |
| 0.7430555555555555 | 233 |
| 0.74375 | 228.436 |
| 0.7444444444444445 | 228.436 |
| 0.7451388888888889 | 228.436 |
| 0.7458333333333332 | 223.873 |
| 0.7465277777777778 | 219.309 |
| 0.7472222222222222 | 219.309 |
| 0.7479166666666667 | 219.309 |
| 0.748611111111111 | 219.309 |
| 0.7493055555555556 | 210.182 |
| 0.75 | 210.182 |
| 0.7506944444444444 | 214.746 |
| 0.751388888888889 | 201.058 |
| 0.7520833333333333 | 205.62 |
| 0.7527777777777778 | 210.182 |
| 0.7534722222222222 | 205.62 |
| 0.7541666666666668 | 210.182 |
| 0.7548611111111111 | 228.436 |
| 0.7555555555555555 | 228.436 |
| 0.75625 | 228.436 |
| 0.7569444444444445 | 228.436 |
| 0.7576388888888889 | 228.436 |
| 0.7583333333333333 | 233 |
| 0.7590277777777777 | 237.564 |
| 0.7597222222222223 | 242.127 |
| 0.7604166666666666 | 242.127 |
| 0.7611111111111111 | 242.127 |
| 0.7618055555555556 | 242.127 |
| 0.7625000000000001 | 242.127 |
| 0.7631944444444444 | 246.689 |
| 0.7638888888888888 | 242.127 |
| 0.7645833333333334 | 233 |
| 0.7652777777777778 | 219.309 |
| 0.7659722222222222 | 219.309 |
| 0.7666666666666666 | 219.309 |
| 0.7673611111111112 | 228.436 |
| 0.7680555555555556 | 228.436 |
| 0.7687499999999999 | 223.873 |
| 0.7694444444444444 | 219.309 |
| 0.7701388888888889 | 214.746 |
| 0.7708333333333334 | 210.182 |
| 0.7715277777777777 | 201.058 |
| 0.7722222222222223 | 196.497 |
| 0.7729166666666667 | 191.937 |
| 0.7736111111111111 | 191.937 |
| 0.7743055555555555 | 191.937 |
| 0.775 | 196.497 |
| 0.7756944444444445 | 191.937 |
| 0.7763888888888889 | 191.937 |
| 0.7770833333333332 | 191.937 |
| 0.7777777777777778 | 187.378 |
| 0.7784722222222222 | 178.264 |
| 0.7791666666666667 | 173.709 |
| 0.779861111111111 | 173.709 |
| 0.7805555555555556 | 164.605 |
| 0.78125 | 155.509 |
| 0.7819444444444444 | 155.509 |
| 0.782638888888889 | 160.056 |
| 0.7833333333333333 | 155.509 |
| 0.7840277777777778 | 155.509 |
| 0.7847222222222222 | 150.964 |
| 0.7854166666666668 | 146.423 |
| 0.7861111111111111 | 141.884 |
| 0.7868055555555555 | 132.814 |
| 0.7875 | 128.284 |
| 0.7881944444444445 | 123.758 |
| 0.7888888888888889 | 123.758 |
| 0.7895833333333333 | 119.235 |
| 0.7902777777777777 | 114.716 |
| 0.7909722222222223 | 110.201 |
| 0.7916666666666666 | 105.69 |
| 0.7923611111111111 | 105.69 |
| 0.7930555555555556 | 101.184 |
| 0.7937500000000001 | 101.184 |
| 0.7944444444444444 | 101.184 |
| 0.7951388888888888 | 96.682 |
| 0.7958333333333334 | 96.682 |
| 0.7965277777777778 | 92.184 |
| 0.7972222222222222 | 87.692 |
| 0.7979166666666666 | 83.205 |
| 0.7986111111111112 | 83.205 |
| 0.7993055555555556 | 78.722 |
| 0.7999999999999999 | 78.722 |
| 0.8006944444444444 | 74.246 |
| 0.8013888888888889 | 74.246 |
| 0.8020833333333334 | 74.246 |
| 0.8027777777777777 | 69.775 |
| 0.8034722222222223 | 69.775 |
| 0.8041666666666667 | 69.775 |
| 0.8048611111111111 | 65.31 |
| 0.8055555555555555 | 65.31 |
| 0.80625 | 65.31 |
| 0.8069444444444445 | 65.31 |
| 0.8076388888888889 | 65.31 |
| 0.8083333333333332 | 65.31 |
| 0.8090277777777778 | 65.31 |
| 0.8097222222222222 | 65.31 |
| 0.8104166666666667 | 65.31 |
| 0.811111111111111 | 60.85 |
| 0.8118055555555556 | 60.85 |
| 0.8125 | 60.85 |
| 0.8131944444444444 | 56.398 |
| 0.813888888888889 | 56.398 |
| 0.8145833333333333 | 56.398 |
| 0.8152777777777778 | 51.951 |
| 0.8159722222222222 | 51.951 |
| 0.8166666666666668 | 51.951 |
| 0.8173611111111111 | 51.951 |
| 0.8180555555555555 | 47.511 |
| 0.81875 | 47.511 |
| 0.8194444444444445 | 47.511 |
| 0.8201388888888889 | 47.511 |
| 0.8208333333333333 | 43.079 |
| 0.8215277777777777 | 43.079 |
| 0.8222222222222223 | 43.079 |
| 0.8229166666666666 | 43.079 |
| 0.8236111111111111 | 38.653 |
| 0.8243055555555556 | 38.653 |
| 0.8250000000000001 | 38.653 |
| 0.8256944444444444 | 34.234 |
| 0.8263888888888888 | 34.234 |
| 0.8270833333333334 | 34.234 |
| 0.8277777777777778 | 34.234 |
| 0.8284722222222222 | 29.823 |
| 0.8291666666666666 | 29.823 |
| 0.8298611111111112 | 29.823 |
| 0.8305555555555556 | 29.823 |
| 0.8312499999999999 | 25.419 |
| 0.8319444444444444 | 25.419 |
| 0.8326388888888889 | 25.419 |
| 0.8333333333333334 | 21.024 |
| 0.8340277777777777 | 21.024 |
| 0.8347222222222223 | 21.024 |
| 0.8354166666666667 | 21.024 |
| 0.8361111111111111 | 21.024 |
| 0.8368055555555555 | 21.024 |
| 0.8375 | 16.636 |
| 0.8381944444444445 | 16.636 |
| 0.8388888888888889 | 16.636 |
| 0.8395833333333332 | 16.636 |
| 0.8402777777777778 | 16.636 |
| 0.8409722222222222 | 16.636 |
| 0.8416666666666667 | 16.636 |
| 0.842361111111111 | 12.257 |
| 0.8430555555555556 | 12.257 |
| 0.84375 | 12.257 |
| 0.8444444444444444 | 12.257 |
| 0.845138888888889 | 12.257 |
| 0.8458333333333333 | 7.887 |
| 0.8465277777777778 | 7.887 |
| 0.8472222222222222 | 7.887 |
| 0.8479166666666668 | 7.887 |
| 0.8486111111111111 | 7.887 |
| 0.8493055555555555 | 7.887 |
| 0.85 | 7.887 |
| 0.8506944444444445 | 3.525 |
| 0.8513888888888889 | 3.525 |
| 0.8520833333333333 | 3.525 |
| 0.8527777777777777 | 3.525 |
| 0.8534722222222223 | 3.525 |
| 0.8541666666666666 | 3.525 |
| 0.8548611111111111 | 3.525 |
| 0.8555555555555556 | 3.525 |
| 0.8562500000000001 | 3.525 |
| 0.8569444444444444 | 3.525 |
| 0.8576388888888888 | 3.525 |
| 0.8583333333333334 | 3.525 |
| 0.8590277777777778 | 3.525 |
| 0.8597222222222222 | 3.525 |
| 0.8604166666666666 | 0 |
| 0.8611111111111112 | 0 |
| 0.8618055555555556 | 0 |
| 0.8624999999999999 | 0 |
| 0.8631944444444444 | 0 |
| 0.8638888888888889 | 0 |
| 0.8645833333333334 | 0 |
| 0.8652777777777777 | 0 |
| 0.8659722222222223 | 0 |
| 0.8666666666666667 | 0 |
| 0.8673611111111111 | 0 |
| 0.8680555555555555 | 0 |
| 0.86875 | 0 |
| 0.8694444444444445 | 0 |
| 0.8701388888888889 | 0 |
| 0.8708333333333332 | 0 |
| 0.8715277777777778 | 0 |
| 0.8722222222222222 | 0 |
| 0.8729166666666667 | 0 |
| 0.873611111111111 | 0 |
| 0.8743055555555556 | 0 |
| 0.875 | 0 |
| 0.8756944444444444 | 0 |
| 0.876388888888889 | 0 |
| 0.8770833333333333 | 0 |
| 0.8777777777777778 | 0 |
| 0.8784722222222222 | 0 |
| 0.8791666666666668 | 0 |
| 0.8798611111111111 | 0 |
| 0.8805555555555555 | 0 |
| 0.88125 | 0 |
| 0.8819444444444445 | 0 |
| 0.8826388888888889 | 0 |
| 0.8833333333333333 | 0 |
| 0.8840277777777777 | 0 |
| 0.8847222222222223 | 0 |
| 0.8854166666666666 | 0 |
| 0.8861111111111111 | 0 |
| 0.8868055555555556 | 0 |
| 0.8875000000000001 | 0 |
| 0.8881944444444444 | 0 |
| 0.8888888888888888 | 0 |
| 0.8895833333333334 | 0 |
| 0.8902777777777778 | 0 |
| 0.8909722222222222 | 0 |
| 0.8916666666666666 | 0 |
| 0.8923611111111112 | 0 |
| 0.8930555555555556 | 0 |
| 0.8937499999999999 | 0 |
| 0.8944444444444444 | 0 |
| 0.8951388888888889 | 0 |
| 0.8958333333333334 | 0 |
| 0.8965277777777777 | 0 |
| 0.8972222222222223 | 0 |
| 0.8979166666666667 | 0 |
| 0.8986111111111111 | 0 |
| 0.8993055555555555 | 0 |
| 0.9 | 0 |
| 0.9006944444444445 | 0 |
| 0.9013888888888889 | 0 |
| 0.9020833333333332 | 0 |
| 0.9027777777777778 | 0 |
| 0.9034722222222222 | 0 |
| 0.9041666666666667 | 0 |
| 0.904861111111111 | 0 |
| 0.9055555555555556 | 0 |
| 0.90625 | 0 |
| 0.9069444444444444 | 0 |
| 0.907638888888889 | 0 |
| 0.9083333333333333 | 0 |
| 0.9090277777777778 | 0 |
| 0.9097222222222222 | 0 |
| 0.9104166666666668 | 0 |
| 0.9111111111111111 | 0 |
| 0.9118055555555555 | 0 |
| 0.9125 | 0 |
| 0.9131944444444445 | 0 |
| 0.9138888888888889 | 0 |
| 0.9145833333333333 | 0 |
| 0.9152777777777777 | 0 |
| 0.9159722222222223 | 0 |
| 0.9166666666666666 | 0 |
| 0.9173611111111111 | 0 |
| 0.9180555555555556 | 0 |
| 0.9187500000000001 | 0 |
| 0.9194444444444444 | 0 |
| 0.9201388888888888 | 0 |
| 0.9208333333333334 | 0 |
| 0.9215277777777778 | 0 |
| 0.9222222222222222 | 0 |
| 0.9229166666666666 | 0 |
| 0.9236111111111112 | 0 |
| 0.9243055555555556 | 0 |
| 0.9249999999999999 | 0 |
| 0.9256944444444444 | 0 |
| 0.9263888888888889 | 0 |
| 0.9270833333333334 | 0 |
| 0.9277777777777777 | 0 |
| 0.9284722222222223 | 0 |
| 0.9291666666666667 | 0 |
| 0.9298611111111111 | 0 |
| 0.9305555555555555 | 0 |
| 0.93125 | 0 |
| 0.9319444444444445 | 0 |
| 0.9326388888888889 | 0 |
| 0.9333333333333332 | 0 |
| 0.9340277777777778 | 0 |
| 0.9347222222222222 | 0 |
| 0.9354166666666667 | 0 |
| 0.936111111111111 | 0 |
| 0.9368055555555556 | 0 |
| 0.9375 | 0 |
| 0.9381944444444444 | 0 |
| 0.938888888888889 | 0 |
| 0.9395833333333333 | 0 |
| 0.9402777777777778 | 0 |
| 0.9409722222222222 | 0 |
| 0.9416666666666668 | 0 |
| 0.9423611111111111 | 0 |
| 0.9430555555555555 | 0 |
| 0.94375 | 0 |
| 0.9444444444444445 | 0 |
| 0.9451388888888889 | 0 |
| 0.9458333333333333 | 0 |
| 0.9465277777777777 | 0 |
| 0.9472222222222223 | 0 |
| 0.9479166666666666 | 0 |
| 0.9486111111111111 | 0 |
| 0.9493055555555556 | 0 |
| 0.9500000000000001 | 0 |
| 0.9506944444444444 | 0 |
| 0.9513888888888888 | 0 |
| 0.9520833333333334 | 0 |
| 0.9527777777777778 | 0 |
| 0.9534722222222222 | 0 |
| 0.9541666666666666 | 0 |
| 0.9548611111111112 | 0 |
| 0.9555555555555556 | 0 |
| 0.9562499999999999 | 0 |
| 0.9569444444444444 | 0 |
| 0.9576388888888889 | 0 |
| 0.9583333333333334 | 0 |
| 0.9590277777777777 | 0 |
| 0.9597222222222223 | 0 |
| 0.9604166666666667 | 0 |
| 0.9611111111111111 | 0 |
| 0.9618055555555555 | 0 |
| 0.9625 | 0 |
| 0.9631944444444445 | 0 |
| 0.9638888888888889 | 0 |
| 0.9645833333333332 | 0 |
| 0.9652777777777778 | 0 |
| 0.9659722222222222 | 0 |
| 0.9666666666666667 | 0 |
| 0.967361111111111 | 0 |
| 0.9680555555555556 | 0 |
| 0.96875 | 0 |
| 0.9694444444444444 | 0 |
| 0.970138888888889 | 0 |
| 0.9708333333333333 | 0 |
| 0.9715277777777778 | 0 |
| 0.9722222222222222 | 0 |
| 0.9729166666666668 | 0 |
| 0.9736111111111111 | 0 |
| 0.9743055555555555 | 0 |
| 0.975 | 0 |
| 0.9756944444444445 | 0 |
| 0.9763888888888889 | 0 |
| 0.9770833333333333 | 0 |
| 0.9777777777777777 | 0 |
| 0.9784722222222223 | 0 |
| 0.9791666666666666 | 0 |
| 0.9798611111111111 | 0 |
| 0.9805555555555556 | 0 |
| 0.9812500000000001 | 0 |
| 0.9819444444444444 | 0 |
| 0.9826388888888888 | 0 |
| 0.9833333333333334 | 0 |
| 0.9840277777777778 | 0 |
| 0.9847222222222222 | 0 |
| 0.9854166666666666 | 0 |
| 0.9861111111111112 | 0 |
| 0.9868055555555556 | 0 |
| 0.9874999999999999 | 0 |
| 0.9881944444444444 | 0 |
| 0.9888888888888889 | 0 |
| 0.9895833333333334 | 0 |
| 0.9902777777777777 | 0 |
| 0.9909722222222223 | 0 |
| 0.9916666666666667 | 0 |
| 0.9923611111111111 | 0 |
| 0.9930555555555555 | 0 |
| 0.99375 | 0 |
| 0.9944444444444445 | 0 |
| 0.9951388888888889 | 0 |
| 0.9958333333333332 | 0 |
| 0.9965277777777778 | 0 |
| 0.9972222222222222 | 0 |
| 0.9979166666666667 | 0 |
| 0.998611111111111 | 0 |
| 0.9993055555555556 | 0 |